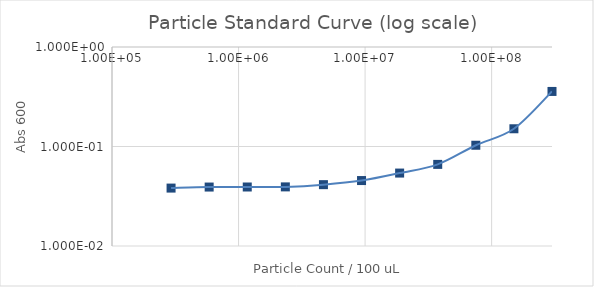
| Category | Series 1 |
|---|---|
| 300000000.0 | 0.358 |
| 150000000.0 | 0.151 |
| 75000000.0 | 0.103 |
| 37500000.0 | 0.066 |
| 18750000.0 | 0.054 |
| 9375000.0 | 0.045 |
| 4687500.0 | 0.041 |
| 2343750.0 | 0.039 |
| 1171875.0 | 0.039 |
| 585937.5 | 0.039 |
| 292968.75 | 0.038 |